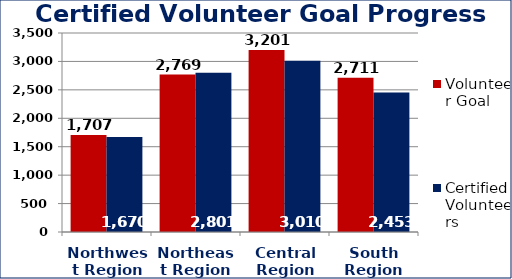
| Category | Volunteer Goal  | Certified Volunteers  |
|---|---|---|
| Northwest Region | 1707 | 1670 |
| Northeast Region | 2769 | 2801 |
| Central Region | 3201 | 3010 |
| South Region | 2711 | 2453 |